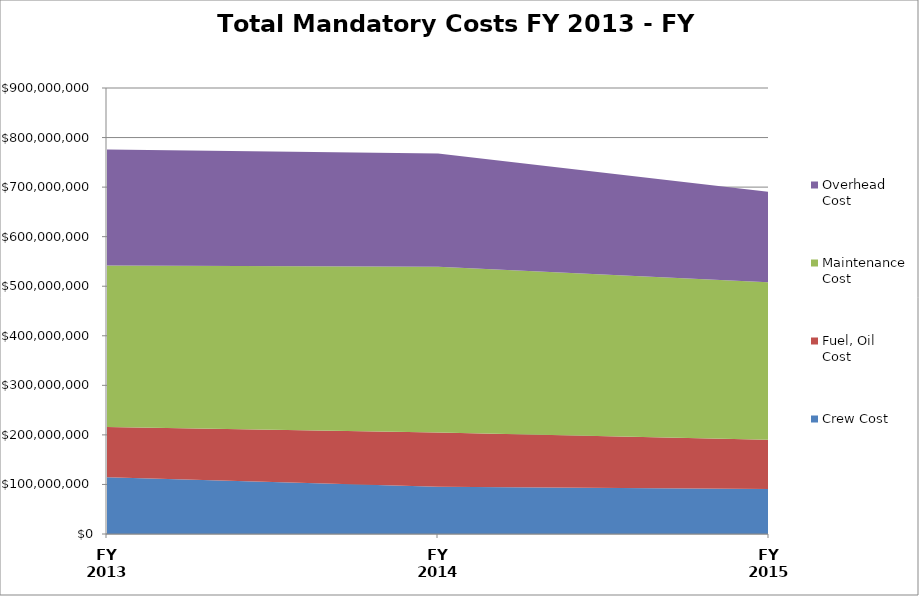
| Category | Crew Cost | Fuel, Oil Cost | Maintenance Cost | Overhead Cost |
|---|---|---|---|---|
| FY 2013 | 114284773 | 101822489 | 325605089 | 233937140 |
| FY 2014 | 95130152 | 109529428 | 334468707 | 228692304 |
| FY 2015 | 90853128 | 99160896 | 317770149 | 182420009 |